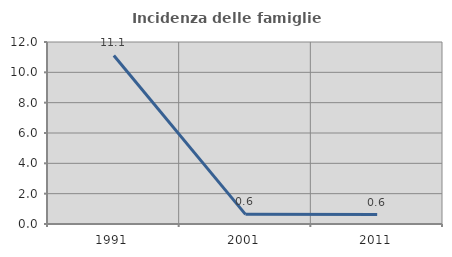
| Category | Incidenza delle famiglie numerose |
|---|---|
| 1991.0 | 11.111 |
| 2001.0 | 0.637 |
| 2011.0 | 0.623 |